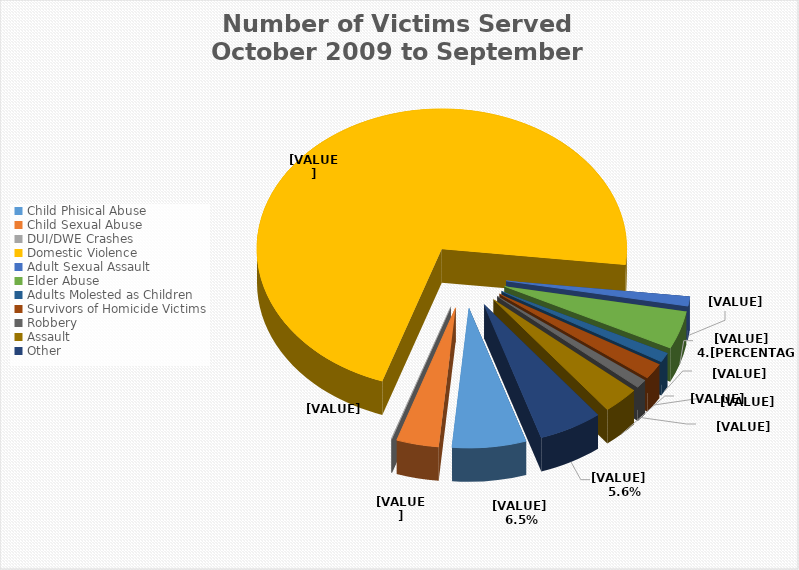
| Category | 2009-2014 |
|---|---|
| Child Phisical Abuse  | 4040 |
| Child Sexual Abuse  | 2305 |
| DUI/DWE Crashes  | 38 |
| Domestic Violence  | 44729 |
| Adult Sexual Assault  | 678 |
| Elder Abuse  | 2741 |
| Adults Molested as Children  | 694 |
| Survivors of Homicide Victims  | 1166 |
| Robbery  | 633 |
| Assault  | 1984 |
| Other  | 3473 |